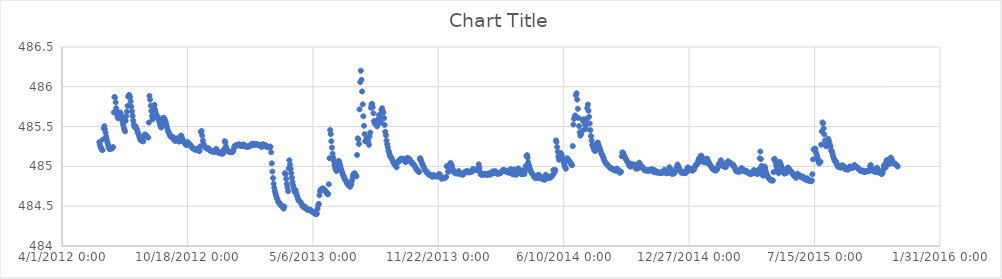
| Category | Series 0 |
|---|---|
| 41059.5 | 485.305 |
| 41060.5 | 485.274 |
| 41061.5 | 485.245 |
| 41062.5 | 485.229 |
| 41063.5 | 485.209 |
| 41064.5 | 485.205 |
| 41065.5 | 485.339 |
| 41066.5 | 485.476 |
| 41067.5 | 485.506 |
| 41068.5 | 485.467 |
| 41069.5 | 485.423 |
| 41070.5 | 485.374 |
| 41071.5 | 485.338 |
| 41072.5 | 485.299 |
| 41073.5 | 485.269 |
| 41074.5 | 485.237 |
| 41075.5 | 485.224 |
| 41076.5 | 485.219 |
| 41077.5 | 485.224 |
| 41078.5 | 485.231 |
| 41079.5 | 485.224 |
| 41080.5 | 485.231 |
| 41081.5 | 485.243 |
| 41082.5 | 485.679 |
| 41083.5 | 485.872 |
| 41084.5 | 485.865 |
| 41085.5 | 485.804 |
| 41086.5 | 485.731 |
| 41087.5 | 485.676 |
| 41088.5 | 485.63 |
| 41089.5 | 485.603 |
| 41090.5 | 485.615 |
| 41091.5 | 485.642 |
| 41092.5 | 485.678 |
| 41093.5 | 485.668 |
| 41094.5 | 485.641 |
| 41095.5 | 485.602 |
| 41096.5 | 485.563 |
| 41097.5 | 485.524 |
| 41098.5 | 485.487 |
| 41099.5 | 485.462 |
| 41100.5 | 485.441 |
| 41101.5 | 485.573 |
| 41102.5 | 485.631 |
| 41103.5 | 485.686 |
| 41104.5 | 485.76 |
| 41105.5 | 485.876 |
| 41106.5 | 485.894 |
| 41107.5 | 485.896 |
| 41108.5 | 485.869 |
| 41109.5 | 485.817 |
| 41110.5 | 485.751 |
| 41111.5 | 485.693 |
| 41112.5 | 485.634 |
| 41113.5 | 485.577 |
| 41114.5 | 485.527 |
| 41115.5 | 485.497 |
| 41116.5 | 485.498 |
| 41117.5 | 485.502 |
| 41118.5 | 485.48 |
| 41119.5 | 485.465 |
| 41120.5 | 485.435 |
| 41121.5 | 485.414 |
| 41122.5 | 485.394 |
| 41123.5 | 485.366 |
| 41124.5 | 485.347 |
| 41125.5 | 485.329 |
| 41126.5 | 485.327 |
| 41127.5 | 485.329 |
| 41128.5 | 485.319 |
| 41129.5 | 485.313 |
| 41130.5 | 485.369 |
| 41131.5 | 485.391 |
| 41132.5 | 485.402 |
| 41133.5 | 485.396 |
| 41134.5 | 485.386 |
| 41135.5 | 485.373 |
| 41136.5 | 485.371 |
| 41137.5 | 485.361 |
| 41138.5 | 485.551 |
| 41139.5 | 485.886 |
| 41140.5 | 485.838 |
| 41141.5 | 485.763 |
| 41142.5 | 485.695 |
| 41143.5 | 485.633 |
| 41144.5 | 485.591 |
| 41145.5 | 485.612 |
| 41146.5 | 485.754 |
| 41147.5 | 485.774 |
| 41148.5 | 485.712 |
| 41149.5 | 485.675 |
| 41150.5 | 485.636 |
| 41151.5 | 485.623 |
| 41152.5 | 485.629 |
| 41153.5 | 485.599 |
| 41154.5 | 485.578 |
| 41155.5 | 485.553 |
| 41156.5 | 485.518 |
| 41157.5 | 485.495 |
| 41158.5 | 485.488 |
| 41159.5 | 485.54 |
| 41160.5 | 485.587 |
| 41161.5 | 485.607 |
| 41162.5 | 485.61 |
| 41163.5 | 485.591 |
| 41164.5 | 485.574 |
| 41165.5 | 485.554 |
| 41166.5 | 485.524 |
| 41167.5 | 485.491 |
| 41168.5 | 485.457 |
| 41169.5 | 485.437 |
| 41170.5 | 485.425 |
| 41171.5 | 485.4 |
| 41172.5 | 485.385 |
| 41173.5 | 485.372 |
| 41174.5 | 485.376 |
| 41175.5 | 485.375 |
| 41176.5 | 485.364 |
| 41177.5 | 485.349 |
| 41178.5 | 485.343 |
| 41179.5 | 485.324 |
| 41180.5 | 485.322 |
| 41181.5 | 485.349 |
| 41182.5 | 485.353 |
| 41183.5 | 485.342 |
| 41184.5 | 485.329 |
| 41185.5 | 485.321 |
| 41186.5 | 485.312 |
| 41187.5 | 485.316 |
| 41188.5 | 485.32 |
| 41189.5 | 485.388 |
| 41190.5 | 485.381 |
| 41191.5 | 485.354 |
| 41192.5 | 485.334 |
| 41193.5 | 485.311 |
| 41194.5 | 485.306 |
| 41195.5 | 485.296 |
| 41196.5 | 485.293 |
| 41197.5 | 485.271 |
| 41198.5 | 485.273 |
| 41199.5 | 485.304 |
| 41200.5 | 485.304 |
| 41201.5 | 485.287 |
| 41202.5 | 485.271 |
| 41203.5 | 485.277 |
| 41204.5 | 485.273 |
| 41205.5 | 485.259 |
| 41206.5 | 485.245 |
| 41207.5 | 485.232 |
| 41208.5 | 485.231 |
| 41209.5 | 485.225 |
| 41210.5 | 485.221 |
| 41211.5 | 485.214 |
| 41212.5 | 485.21 |
| 41213.5 | 485.211 |
| 41214.5 | 485.217 |
| 41215.5 | 485.221 |
| 41216.5 | 485.207 |
| 41217.5 | 485.203 |
| 41218.5 | 485.193 |
| 41219.5 | 485.197 |
| 41220.5 | 485.252 |
| 41221.5 | 485.435 |
| 41222.5 | 485.445 |
| 41223.5 | 485.388 |
| 41224.5 | 485.327 |
| 41225.5 | 485.287 |
| 41226.5 | 485.259 |
| 41227.5 | 485.246 |
| 41228.5 | 485.244 |
| 41229.5 | 485.237 |
| 41230.5 | 485.227 |
| 41231.5 | 485.225 |
| 41232.5 | 485.225 |
| 41233.5 | 485.227 |
| 41234.5 | 485.216 |
| 41235.5 | 485.203 |
| 41236.5 | 485.198 |
| 41237.5 | 485.193 |
| 41238.5 | 485.192 |
| 41239.5 | 485.186 |
| 41240.5 | 485.19 |
| 41241.5 | 485.19 |
| 41242.5 | 485.188 |
| 41243.5 | 485.183 |
| 41244.5 | 485.185 |
| 41245.5 | 485.219 |
| 41246.5 | 485.213 |
| 41247.5 | 485.185 |
| 41248.5 | 485.181 |
| 41249.5 | 485.177 |
| 41250.5 | 485.168 |
| 41251.5 | 485.169 |
| 41252.5 | 485.174 |
| 41253.5 | 485.173 |
| 41254.5 | 485.159 |
| 41255.5 | 485.16 |
| 41256.5 | 485.164 |
| 41257.5 | 485.17 |
| 41258.5 | 485.216 |
| 41259.5 | 485.317 |
| 41260.5 | 485.299 |
| 41261.5 | 485.25 |
| 41262.5 | 485.218 |
| 41263.5 | 485.208 |
| 41264.5 | 485.198 |
| 41265.5 | 485.19 |
| 41266.5 | 485.188 |
| 41267.5 | 485.182 |
| 41268.5 | 485.18 |
| 41269.5 | 485.179 |
| 41270.5 | 485.178 |
| 41271.5 | 485.181 |
| 41272.5 | 485.19 |
| 41273.5 | 485.203 |
| 41274.5 | 485.242 |
| 41275.5 | 485.257 |
| 41276.5 | 485.262 |
| 41277.5 | 485.263 |
| 41278.5 | 485.263 |
| 41279.5 | 485.261 |
| 41280.5 | 485.27 |
| 41281.5 | 485.272 |
| 41282.5 | 485.278 |
| 41283.5 | 485.269 |
| 41284.5 | 485.26 |
| 41285.5 | 485.257 |
| 41286.5 | 485.255 |
| 41287.5 | 485.261 |
| 41288.5 | 485.273 |
| 41289.5 | 485.275 |
| 41290.5 | 485.267 |
| 41291.5 | 485.254 |
| 41292.5 | 485.252 |
| 41293.5 | 485.248 |
| 41294.5 | 485.25 |
| 41295.5 | 485.246 |
| 41296.5 | 485.248 |
| 41297.5 | 485.253 |
| 41298.5 | 485.253 |
| 41299.5 | 485.251 |
| 41300.5 | 485.262 |
| 41301.5 | 485.279 |
| 41302.5 | 485.281 |
| 41303.5 | 485.277 |
| 41304.5 | 485.285 |
| 41305.5 | 485.271 |
| 41306.5 | 485.268 |
| 41307.5 | 485.281 |
| 41308.5 | 485.28 |
| 41309.5 | 485.278 |
| 41310.5 | 485.28 |
| 41311.5 | 485.273 |
| 41312.5 | 485.274 |
| 41313.5 | 485.266 |
| 41314.5 | 485.265 |
| 41315.5 | 485.269 |
| 41316.5 | 485.26 |
| 41317.5 | 485.255 |
| 41318.5 | 485.244 |
| 41319.5 | 485.266 |
| 41320.5 | 485.278 |
| 41321.5 | 485.271 |
| 41322.5 | 485.268 |
| 41323.5 | 485.262 |
| 41324.5 | 485.263 |
| 41325.5 | 485.26 |
| 41326.5 | 485.243 |
| 41327.5 | 485.247 |
| 41328.5 | 485.243 |
| 41329.5 | 485.245 |
| 41330.5 | 485.244 |
| 41331.5 | 485.249 |
| 41332.5 | 485.245 |
| 41333.5 | 485.177 |
| 41334.5 | 485.038 |
| 41335.5 | 484.935 |
| 41336.5 | 484.853 |
| 41337.5 | 484.781 |
| 41338.5 | 484.732 |
| 41339.5 | 484.687 |
| 41340.5 | 484.655 |
| 41341.5 | 484.629 |
| 41342.5 | 484.598 |
| 41343.5 | 484.59 |
| 41344.5 | 484.562 |
| 41345.5 | 484.546 |
| 41346.5 | 484.536 |
| 41347.5 | 484.531 |
| 41348.5 | 484.52 |
| 41349.5 | 484.506 |
| 41350.5 | 484.504 |
| 41351.5 | 484.489 |
| 41352.5 | 484.484 |
| 41353.5 | 484.469 |
| 41354.5 | 484.497 |
| 41355.5 | 484.916 |
| 41356.5 | 484.899 |
| 41357.5 | 484.843 |
| 41358.5 | 484.78 |
| 41359.5 | 484.735 |
| 41360.5 | 484.689 |
| 41361.5 | 484.976 |
| 41362.5 | 485.076 |
| 41363.5 | 485.022 |
| 41364.5 | 484.971 |
| 41365.5 | 484.916 |
| 41366.5 | 484.859 |
| 41367.5 | 484.803 |
| 41368.5 | 484.765 |
| 41369.5 | 484.722 |
| 41370.5 | 484.698 |
| 41371.5 | 484.675 |
| 41372.5 | 484.702 |
| 41373.5 | 484.665 |
| 41374.5 | 484.638 |
| 41375.5 | 484.614 |
| 41376.5 | 484.589 |
| 41377.5 | 484.57 |
| 41378.5 | 484.565 |
| 41379.5 | 484.559 |
| 41380.5 | 484.553 |
| 41381.5 | 484.529 |
| 41382.5 | 484.523 |
| 41383.5 | 484.505 |
| 41384.5 | 484.491 |
| 41385.5 | 484.485 |
| 41386.5 | 484.486 |
| 41387.5 | 484.493 |
| 41388.5 | 484.474 |
| 41389.5 | 484.467 |
| 41390.5 | 484.464 |
| 41391.5 | 484.452 |
| 41392.5 | 484.456 |
| 41393.5 | 484.456 |
| 41394.5 | 484.456 |
| 41395.5 | 484.455 |
| 41396.5 | 484.452 |
| 41397.5 | 484.44 |
| 41398.5 | 484.435 |
| 41399.5 | 484.429 |
| 41400.5 | 484.426 |
| 41401.5 | 484.421 |
| 41402.5 | 484.411 |
| 41403.5 | 484.411 |
| 41404.5 | 484.404 |
| 41405.5 | 484.399 |
| 41406.5 | 484.408 |
| 41407.5 | 484.469 |
| 41408.5 | 484.512 |
| 41409.5 | 484.53 |
| 41410.5 | 484.637 |
| 41411.5 | 484.688 |
| 41412.5 | 484.709 |
| 41413.5 | 484.712 |
| 41414.5 | 484.704 |
| 41415.5 | 484.724 |
| 41416.5 | 484.72 |
| 41417.5 | 484.712 |
| 41418.5 | 484.705 |
| 41419.5 | 484.7 |
| 41420.5 | 484.687 |
| 41421.5 | 484.674 |
| 41422.5 | 484.658 |
| 41423.5 | 484.648 |
| 41424.5 | 484.655 |
| 41425.5 | 484.776 |
| 41426.5 | 485.103 |
| 41427.5 | 485.456 |
| 41428.5 | 485.407 |
| 41429.5 | 485.315 |
| 41430.5 | 485.236 |
| 41431.5 | 485.161 |
| 41432.5 | 485.109 |
| 41433.5 | 485.066 |
| 41434.5 | 485.023 |
| 41435.5 | 484.987 |
| 41436.5 | 484.958 |
| 41437.5 | 484.942 |
| 41438.5 | 484.982 |
| 41439.5 | 485.046 |
| 41440.5 | 485.067 |
| 41441.5 | 485.066 |
| 41442.5 | 485.041 |
| 41443.5 | 485.015 |
| 41444.5 | 484.978 |
| 41445.5 | 484.955 |
| 41446.5 | 484.929 |
| 41447.5 | 484.904 |
| 41448.5 | 484.885 |
| 41449.5 | 484.869 |
| 41450.5 | 484.846 |
| 41451.5 | 484.831 |
| 41452.5 | 484.824 |
| 41453.5 | 484.806 |
| 41454.5 | 484.791 |
| 41455.5 | 484.781 |
| 41456.5 | 484.767 |
| 41457.5 | 484.76 |
| 41458.5 | 484.749 |
| 41459.5 | 484.745 |
| 41460.5 | 484.766 |
| 41461.5 | 484.781 |
| 41462.5 | 484.825 |
| 41463.5 | 484.867 |
| 41464.5 | 484.897 |
| 41465.5 | 484.909 |
| 41466.5 | 484.913 |
| 41467.5 | 484.893 |
| 41468.5 | 484.887 |
| 41469.5 | 484.874 |
| 41470.5 | 485.143 |
| 41471.5 | 485.353 |
| 41472.5 | 485.341 |
| 41473.5 | 485.282 |
| 41474.5 | 485.716 |
| 41475.5 | 486.058 |
| 41476.5 | 486.202 |
| 41477.5 | 486.088 |
| 41478.5 | 485.942 |
| 41479.5 | 485.78 |
| 41480.5 | 485.63 |
| 41481.5 | 485.51 |
| 41482.5 | 485.405 |
| 41483.5 | 485.315 |
| 41484.5 | 485.324 |
| 41485.5 | 485.342 |
| 41486.5 | 485.356 |
| 41487.5 | 485.339 |
| 41488.5 | 485.303 |
| 41489.5 | 485.271 |
| 41490.5 | 485.376 |
| 41491.5 | 485.425 |
| 41492.5 | 485.737 |
| 41493.5 | 485.779 |
| 41494.5 | 485.784 |
| 41495.5 | 485.743 |
| 41496.5 | 485.667 |
| 41497.5 | 485.57 |
| 41498.5 | 485.539 |
| 41499.5 | 485.56 |
| 41500.5 | 485.568 |
| 41501.5 | 485.539 |
| 41502.5 | 485.503 |
| 41503.5 | 485.552 |
| 41504.5 | 485.595 |
| 41505.5 | 485.647 |
| 41506.5 | 485.622 |
| 41507.5 | 485.552 |
| 41508.5 | 485.553 |
| 41509.5 | 485.707 |
| 41510.5 | 485.731 |
| 41511.5 | 485.696 |
| 41512.5 | 485.674 |
| 41513.5 | 485.607 |
| 41514.5 | 485.521 |
| 41515.5 | 485.436 |
| 41516.5 | 485.391 |
| 41517.5 | 485.323 |
| 41518.5 | 485.28 |
| 41519.5 | 485.241 |
| 41520.5 | 485.198 |
| 41521.5 | 485.178 |
| 41522.5 | 485.144 |
| 41523.5 | 485.123 |
| 41524.5 | 485.113 |
| 41525.5 | 485.104 |
| 41526.5 | 485.083 |
| 41527.5 | 485.069 |
| 41528.5 | 485.052 |
| 41529.5 | 485.036 |
| 41530.5 | 485.019 |
| 41531.5 | 485.016 |
| 41532.5 | 485.009 |
| 41533.5 | 484.988 |
| 41534.5 | 485.053 |
| 41535.5 | 485.055 |
| 41536.5 | 485.055 |
| 41537.5 | 485.066 |
| 41538.5 | 485.081 |
| 41539.5 | 485.089 |
| 41540.5 | 485.095 |
| 41541.5 | 485.097 |
| 41542.5 | 485.094 |
| 41543.5 | 485.089 |
| 41544.5 | 485.094 |
| 41545.5 | 485.084 |
| 41546.5 | 485.071 |
| 41547.5 | 485.054 |
| 41548.5 | 485.057 |
| 41549.5 | 485.091 |
| 41550.5 | 485.108 |
| 41551.5 | 485.101 |
| 41552.5 | 485.095 |
| 41553.5 | 485.095 |
| 41554.5 | 485.086 |
| 41555.5 | 485.072 |
| 41556.5 | 485.054 |
| 41557.5 | 485.045 |
| 41558.5 | 485.047 |
| 41559.5 | 485.031 |
| 41560.5 | 485.026 |
| 41561.5 | 485.015 |
| 41562.5 | 485.001 |
| 41563.5 | 484.99 |
| 41564.5 | 484.973 |
| 41565.5 | 484.958 |
| 41566.5 | 484.956 |
| 41567.5 | 484.946 |
| 41568.5 | 484.935 |
| 41569.5 | 484.929 |
| 41570.5 | 485.092 |
| 41571.5 | 485.103 |
| 41572.5 | 485.076 |
| 41573.5 | 485.048 |
| 41574.5 | 485.033 |
| 41575.5 | 485.012 |
| 41576.5 | 484.997 |
| 41577.5 | 484.979 |
| 41578.5 | 484.96 |
| 41579.5 | 484.947 |
| 41580.5 | 484.937 |
| 41581.5 | 484.928 |
| 41582.5 | 484.927 |
| 41583.5 | 484.909 |
| 41584.5 | 484.898 |
| 41585.5 | 484.899 |
| 41586.5 | 484.896 |
| 41587.5 | 484.888 |
| 41588.5 | 484.885 |
| 41589.5 | 484.877 |
| 41590.5 | 484.873 |
| 41591.5 | 484.873 |
| 41592.5 | 484.892 |
| 41593.5 | 484.885 |
| 41594.5 | 484.879 |
| 41595.5 | 484.875 |
| 41596.5 | 484.878 |
| 41597.5 | 484.874 |
| 41598.5 | 484.88 |
| 41599.5 | 484.884 |
| 41600.5 | 484.9 |
| 41601.5 | 484.901 |
| 41602.5 | 484.898 |
| 41603.5 | 484.866 |
| 41604.5 | 484.853 |
| 41605.5 | 484.845 |
| 41606.5 | 484.851 |
| 41607.5 | 484.854 |
| 41608.5 | 484.854 |
| 41609.5 | 484.85 |
| 41610.5 | 484.853 |
| 41611.5 | 484.865 |
| 41612.5 | 484.866 |
| 41613.5 | 485.003 |
| 41614.5 | 484.995 |
| 41615.5 | 484.936 |
| 41616.5 | 484.933 |
| 41617.5 | 484.954 |
| 41618.5 | 485.021 |
| 41619.5 | 485.045 |
| 41620.5 | 485.028 |
| 41621.5 | 485.011 |
| 41622.5 | 484.975 |
| 41623.5 | 484.955 |
| 41624.5 | 484.936 |
| 41625.5 | 484.925 |
| 41626.5 | 484.92 |
| 41627.5 | 484.912 |
| 41628.5 | 484.92 |
| 41629.5 | 484.913 |
| 41630.5 | 484.912 |
| 41631.5 | 484.92 |
| 41632.5 | 484.942 |
| 41633.5 | 484.915 |
| 41634.5 | 484.903 |
| 41635.5 | 484.909 |
| 41636.5 | 484.9 |
| 41637.5 | 484.905 |
| 41638.5 | 484.898 |
| 41639.5 | 484.897 |
| 41640.5 | 484.903 |
| 41641.5 | 484.922 |
| 41642.5 | 484.929 |
| 41643.5 | 484.932 |
| 41644.5 | 484.939 |
| 41645.5 | 484.942 |
| 41646.5 | 484.937 |
| 41647.5 | 484.927 |
| 41648.5 | 484.928 |
| 41649.5 | 484.925 |
| 41650.5 | 484.929 |
| 41651.5 | 484.931 |
| 41652.5 | 484.928 |
| 41653.5 | 484.941 |
| 41654.5 | 484.962 |
| 41655.5 | 484.965 |
| 41656.5 | 484.961 |
| 41657.5 | 484.957 |
| 41658.5 | 484.952 |
| 41659.5 | 484.958 |
| 41660.5 | 484.956 |
| 41661.5 | 484.953 |
| 41662.5 | 484.955 |
| 41663.5 | 484.973 |
| 41664.5 | 485.026 |
| 41665.5 | 484.982 |
| 41666.5 | 484.933 |
| 41667.5 | 484.9 |
| 41668.5 | 484.9 |
| 41669.5 | 484.895 |
| 41670.5 | 484.9 |
| 41671.5 | 484.895 |
| 41672.5 | 484.899 |
| 41673.5 | 484.904 |
| 41674.5 | 484.907 |
| 41675.5 | 484.9 |
| 41676.5 | 484.898 |
| 41677.5 | 484.898 |
| 41678.5 | 484.89 |
| 41679.5 | 484.898 |
| 41680.5 | 484.913 |
| 41681.5 | 484.903 |
| 41682.5 | 484.9 |
| 41683.5 | 484.898 |
| 41684.5 | 484.919 |
| 41685.5 | 484.923 |
| 41686.5 | 484.936 |
| 41687.5 | 484.935 |
| 41688.5 | 484.914 |
| 41689.5 | 484.917 |
| 41690.5 | 484.938 |
| 41691.5 | 484.935 |
| 41692.5 | 484.916 |
| 41693.5 | 484.911 |
| 41694.5 | 484.907 |
| 41695.5 | 484.909 |
| 41696.5 | 484.913 |
| 41697.5 | 484.915 |
| 41698.5 | 484.914 |
| 41699.5 | 484.916 |
| 41700.5 | 484.93 |
| 41701.5 | 484.94 |
| 41702.5 | 484.948 |
| 41703.5 | 484.953 |
| 41704.5 | 484.953 |
| 41705.5 | 484.953 |
| 41706.5 | 484.943 |
| 41707.5 | 484.945 |
| 41708.5 | 484.934 |
| 41709.5 | 484.927 |
| 41710.5 | 484.931 |
| 41711.5 | 484.938 |
| 41712.5 | 484.929 |
| 41713.5 | 484.917 |
| 41714.5 | 484.957 |
| 41715.5 | 484.966 |
| 41716.5 | 484.943 |
| 41717.5 | 484.922 |
| 41718.5 | 484.904 |
| 41719.5 | 484.899 |
| 41720.5 | 484.961 |
| 41721.5 | 484.944 |
| 41722.5 | 484.924 |
| 41723.5 | 484.9 |
| 41724.5 | 484.896 |
| 41725.5 | 484.921 |
| 41726.5 | 484.957 |
| 41727.5 | 484.975 |
| 41728.5 | 484.95 |
| 41729.5 | 484.948 |
| 41730.5 | 484.928 |
| 41731.5 | 484.912 |
| 41732.5 | 484.902 |
| 41733.5 | 484.949 |
| 41734.5 | 484.948 |
| 41735.5 | 484.926 |
| 41736.5 | 484.905 |
| 41737.5 | 484.906 |
| 41738.5 | 484.944 |
| 41739.5 | 485.006 |
| 41740.5 | 485.132 |
| 41741.5 | 485.142 |
| 41742.5 | 485.11 |
| 41743.5 | 485.051 |
| 41744.5 | 485.016 |
| 41745.5 | 484.985 |
| 41746.5 | 484.959 |
| 41747.5 | 484.937 |
| 41748.5 | 484.925 |
| 41749.5 | 484.909 |
| 41750.5 | 484.901 |
| 41751.5 | 484.893 |
| 41752.5 | 484.88 |
| 41753.5 | 484.861 |
| 41754.5 | 484.862 |
| 41755.5 | 484.858 |
| 41756.5 | 484.854 |
| 41757.5 | 484.854 |
| 41758.5 | 484.854 |
| 41759.5 | 484.896 |
| 41760.5 | 484.892 |
| 41761.5 | 484.875 |
| 41762.5 | 484.859 |
| 41763.5 | 484.853 |
| 41764.5 | 484.846 |
| 41765.5 | 484.849 |
| 41766.5 | 484.849 |
| 41767.5 | 484.847 |
| 41768.5 | 484.838 |
| 41769.5 | 484.83 |
| 41770.5 | 484.883 |
| 41771.5 | 484.894 |
| 41772.5 | 484.884 |
| 41773.5 | 484.866 |
| 41774.5 | 484.855 |
| 41775.5 | 484.854 |
| 41776.5 | 484.858 |
| 41777.5 | 484.857 |
| 41778.5 | 484.857 |
| 41779.5 | 484.869 |
| 41780.5 | 484.881 |
| 41781.5 | 484.878 |
| 41782.5 | 484.891 |
| 41783.5 | 484.954 |
| 41784.5 | 484.949 |
| 41785.5 | 484.924 |
| 41786.5 | 484.954 |
| 41787.5 | 485.327 |
| 41788.5 | 485.308 |
| 41789.5 | 485.243 |
| 41790.5 | 485.182 |
| 41791.5 | 485.124 |
| 41792.5 | 485.083 |
| 41793.5 | 485.112 |
| 41794.5 | 485.167 |
| 41795.5 | 485.164 |
| 41796.5 | 485.149 |
| 41797.5 | 485.123 |
| 41798.5 | 485.09 |
| 41799.5 | 485.066 |
| 41800.5 | 485.036 |
| 41801.5 | 485.007 |
| 41802.5 | 484.984 |
| 41803.5 | 484.971 |
| 41804.5 | 485.079 |
| 41805.5 | 485.102 |
| 41806.5 | 485.093 |
| 41807.5 | 485.084 |
| 41808.5 | 485.07 |
| 41809.5 | 485.059 |
| 41810.5 | 485.047 |
| 41811.5 | 485.04 |
| 41812.5 | 485.018 |
| 41813.5 | 485.015 |
| 41814.5 | 485.256 |
| 41815.5 | 485.526 |
| 41816.5 | 485.598 |
| 41817.5 | 485.628 |
| 41818.5 | 485.64 |
| 41819.5 | 485.895 |
| 41820.5 | 485.919 |
| 41821.5 | 485.84 |
| 41822.5 | 485.723 |
| 41823.5 | 485.608 |
| 41824.5 | 485.506 |
| 41825.5 | 485.427 |
| 41826.5 | 485.386 |
| 41827.5 | 485.403 |
| 41828.5 | 485.436 |
| 41829.5 | 485.448 |
| 41830.5 | 485.578 |
| 41831.5 | 485.592 |
| 41832.5 | 485.565 |
| 41833.5 | 485.542 |
| 41834.5 | 485.51 |
| 41835.5 | 485.47 |
| 41836.5 | 485.595 |
| 41837.5 | 485.731 |
| 41838.5 | 485.777 |
| 41839.5 | 485.7 |
| 41840.5 | 485.623 |
| 41841.5 | 485.539 |
| 41842.5 | 485.455 |
| 41843.5 | 485.382 |
| 41844.5 | 485.325 |
| 41845.5 | 485.272 |
| 41846.5 | 485.258 |
| 41847.5 | 485.233 |
| 41848.5 | 485.207 |
| 41849.5 | 485.196 |
| 41850.5 | 485.195 |
| 41851.5 | 485.233 |
| 41852.5 | 485.26 |
| 41853.5 | 485.294 |
| 41854.5 | 485.299 |
| 41855.5 | 485.272 |
| 41856.5 | 485.244 |
| 41857.5 | 485.229 |
| 41858.5 | 485.206 |
| 41859.5 | 485.176 |
| 41860.5 | 485.155 |
| 41861.5 | 485.145 |
| 41862.5 | 485.124 |
| 41863.5 | 485.101 |
| 41864.5 | 485.083 |
| 41865.5 | 485.06 |
| 41866.5 | 485.051 |
| 41867.5 | 485.04 |
| 41868.5 | 485.029 |
| 41869.5 | 485.02 |
| 41870.5 | 485.012 |
| 41871.5 | 485.002 |
| 41872.5 | 484.994 |
| 41873.5 | 484.985 |
| 41874.5 | 484.985 |
| 41875.5 | 484.971 |
| 41876.5 | 484.975 |
| 41877.5 | 484.968 |
| 41878.5 | 484.965 |
| 41879.5 | 484.959 |
| 41880.5 | 484.961 |
| 41881.5 | 484.947 |
| 41882.5 | 484.957 |
| 41883.5 | 484.948 |
| 41884.5 | 484.973 |
| 41885.5 | 484.965 |
| 41886.5 | 484.957 |
| 41887.5 | 484.94 |
| 41888.5 | 484.928 |
| 41889.5 | 484.921 |
| 41890.5 | 484.925 |
| 41891.5 | 484.934 |
| 41892.5 | 485.128 |
| 41893.5 | 485.176 |
| 41894.5 | 485.171 |
| 41895.5 | 485.152 |
| 41896.5 | 485.137 |
| 41897.5 | 485.118 |
| 41898.5 | 485.099 |
| 41899.5 | 485.09 |
| 41900.5 | 485.073 |
| 41901.5 | 485.06 |
| 41902.5 | 485.048 |
| 41903.5 | 485.034 |
| 41904.5 | 485.01 |
| 41905.5 | 485.009 |
| 41906.5 | 484.995 |
| 41907.5 | 485.034 |
| 41908.5 | 485.029 |
| 41909.5 | 485.015 |
| 41910.5 | 485.022 |
| 41911.5 | 485.012 |
| 41912.5 | 485.023 |
| 41913.5 | 485.01 |
| 41914.5 | 484.983 |
| 41915.5 | 484.973 |
| 41916.5 | 484.973 |
| 41917.5 | 484.979 |
| 41918.5 | 484.976 |
| 41919.5 | 485.033 |
| 41920.5 | 485.048 |
| 41921.5 | 485.028 |
| 41922.5 | 485.006 |
| 41923.5 | 484.99 |
| 41924.5 | 484.987 |
| 41925.5 | 484.989 |
| 41926.5 | 484.986 |
| 41927.5 | 484.971 |
| 41928.5 | 484.958 |
| 41929.5 | 484.952 |
| 41930.5 | 484.951 |
| 41931.5 | 484.954 |
| 41932.5 | 484.948 |
| 41933.5 | 484.946 |
| 41934.5 | 484.944 |
| 41935.5 | 484.951 |
| 41936.5 | 484.955 |
| 41937.5 | 484.956 |
| 41938.5 | 484.949 |
| 41939.5 | 484.957 |
| 41940.5 | 484.966 |
| 41941.5 | 484.95 |
| 41942.5 | 484.946 |
| 41943.5 | 484.93 |
| 41944.5 | 484.937 |
| 41945.5 | 484.951 |
| 41946.5 | 484.936 |
| 41947.5 | 484.923 |
| 41948.5 | 484.927 |
| 41949.5 | 484.925 |
| 41950.5 | 484.927 |
| 41951.5 | 484.923 |
| 41952.5 | 484.924 |
| 41953.5 | 484.924 |
| 41954.5 | 484.917 |
| 41955.5 | 484.915 |
| 41956.5 | 484.917 |
| 41957.5 | 484.926 |
| 41958.5 | 484.924 |
| 41959.5 | 484.94 |
| 41960.5 | 484.959 |
| 41961.5 | 484.938 |
| 41962.5 | 484.919 |
| 41963.5 | 484.92 |
| 41964.5 | 484.914 |
| 41965.5 | 484.922 |
| 41966.5 | 484.921 |
| 41967.5 | 484.921 |
| 41968.5 | 484.989 |
| 41969.5 | 484.972 |
| 41970.5 | 484.936 |
| 41971.5 | 484.92 |
| 41972.5 | 484.908 |
| 41973.5 | 484.905 |
| 41974.5 | 484.913 |
| 41975.5 | 484.924 |
| 41976.5 | 484.914 |
| 41977.5 | 484.942 |
| 41978.5 | 484.947 |
| 41979.5 | 484.976 |
| 41980.5 | 484.997 |
| 41981.5 | 485.024 |
| 41982.5 | 485.006 |
| 41983.5 | 484.982 |
| 41984.5 | 484.964 |
| 41985.5 | 484.952 |
| 41986.5 | 484.938 |
| 41987.5 | 484.922 |
| 41988.5 | 484.92 |
| 41989.5 | 484.926 |
| 41990.5 | 484.924 |
| 41991.5 | 484.92 |
| 41992.5 | 484.922 |
| 41993.5 | 484.914 |
| 41994.5 | 484.922 |
| 41995.5 | 484.922 |
| 41996.5 | 484.96 |
| 41997.5 | 484.985 |
| 41998.5 | 484.986 |
| 41999.5 | 484.979 |
| 42000.5 | 484.964 |
| 42001.5 | 484.951 |
| 42002.5 | 484.961 |
| 42003.5 | 484.968 |
| 42004.5 | 484.95 |
| 42005.5 | 484.947 |
| 42006.5 | 484.957 |
| 42007.5 | 484.966 |
| 42008.5 | 484.972 |
| 42009.5 | 485 |
| 42010.5 | 485.019 |
| 42011.5 | 485.021 |
| 42012.5 | 485.024 |
| 42013.5 | 485.047 |
| 42014.5 | 485.072 |
| 42015.5 | 485.099 |
| 42016.5 | 485.089 |
| 42017.5 | 485.059 |
| 42018.5 | 485.13 |
| 42019.5 | 485.135 |
| 42020.5 | 485.113 |
| 42021.5 | 485.087 |
| 42022.5 | 485.073 |
| 42023.5 | 485.054 |
| 42024.5 | 485.053 |
| 42025.5 | 485.072 |
| 42026.5 | 485.063 |
| 42027.5 | 485.046 |
| 42028.5 | 485.098 |
| 42029.5 | 485.081 |
| 42030.5 | 485.062 |
| 42031.5 | 485.046 |
| 42032.5 | 485.032 |
| 42033.5 | 485.016 |
| 42034.5 | 485.012 |
| 42035.5 | 484.991 |
| 42036.5 | 484.984 |
| 42037.5 | 484.968 |
| 42038.5 | 484.963 |
| 42039.5 | 484.959 |
| 42040.5 | 484.955 |
| 42041.5 | 484.95 |
| 42042.5 | 484.949 |
| 42043.5 | 484.953 |
| 42044.5 | 484.964 |
| 42045.5 | 484.989 |
| 42046.5 | 484.999 |
| 42047.5 | 485.031 |
| 42048.5 | 485.034 |
| 42049.5 | 485.025 |
| 42050.5 | 485.077 |
| 42051.5 | 485.06 |
| 42052.5 | 485.027 |
| 42053.5 | 485.004 |
| 42054.5 | 485.022 |
| 42055.5 | 485.013 |
| 42056.5 | 485 |
| 42057.5 | 484.99 |
| 42058.5 | 484.991 |
| 42059.5 | 485.027 |
| 42060.5 | 485.051 |
| 42061.5 | 485.051 |
| 42062.5 | 485.064 |
| 42063.5 | 485.049 |
| 42064.5 | 485.041 |
| 42065.5 | 485.044 |
| 42066.5 | 485.039 |
| 42067.5 | 485.028 |
| 42068.5 | 485.019 |
| 42069.5 | 485.015 |
| 42070.5 | 485.019 |
| 42071.5 | 485.002 |
| 42072.5 | 484.985 |
| 42073.5 | 484.966 |
| 42074.5 | 484.946 |
| 42075.5 | 484.94 |
| 42076.5 | 484.939 |
| 42077.5 | 484.942 |
| 42078.5 | 484.933 |
| 42079.5 | 484.939 |
| 42080.5 | 484.934 |
| 42081.5 | 484.946 |
| 42082.5 | 484.967 |
| 42083.5 | 484.978 |
| 42084.5 | 484.974 |
| 42085.5 | 484.959 |
| 42086.5 | 484.944 |
| 42087.5 | 484.945 |
| 42088.5 | 484.947 |
| 42089.5 | 484.943 |
| 42090.5 | 484.931 |
| 42091.5 | 484.941 |
| 42092.5 | 484.937 |
| 42093.5 | 484.922 |
| 42094.5 | 484.916 |
| 42095.5 | 484.918 |
| 42096.5 | 484.909 |
| 42097.5 | 484.904 |
| 42098.5 | 484.901 |
| 42099.5 | 484.913 |
| 42100.5 | 484.912 |
| 42101.5 | 484.922 |
| 42102.5 | 484.947 |
| 42103.5 | 484.954 |
| 42104.5 | 484.938 |
| 42105.5 | 484.92 |
| 42106.5 | 484.912 |
| 42107.5 | 484.912 |
| 42108.5 | 484.907 |
| 42109.5 | 484.906 |
| 42110.5 | 484.951 |
| 42111.5 | 484.963 |
| 42112.5 | 485.101 |
| 42113.5 | 485.187 |
| 42114.5 | 485.093 |
| 42115.5 | 485.007 |
| 42116.5 | 484.935 |
| 42117.5 | 484.887 |
| 42118.5 | 484.886 |
| 42119.5 | 484.945 |
| 42120.5 | 484.998 |
| 42121.5 | 484.97 |
| 42122.5 | 484.931 |
| 42123.5 | 484.903 |
| 42124.5 | 484.888 |
| 42125.5 | 484.868 |
| 42126.5 | 484.858 |
| 42127.5 | 484.846 |
| 42128.5 | 484.842 |
| 42129.5 | 484.834 |
| 42130.5 | 484.826 |
| 42131.5 | 484.824 |
| 42132.5 | 484.827 |
| 42133.5 | 484.822 |
| 42134.5 | 484.928 |
| 42135.5 | 485.086 |
| 42136.5 | 485.094 |
| 42137.5 | 485.065 |
| 42138.5 | 485.023 |
| 42139.5 | 484.991 |
| 42140.5 | 484.966 |
| 42141.5 | 484.939 |
| 42142.5 | 484.914 |
| 42143.5 | 484.936 |
| 42144.5 | 485.056 |
| 42145.5 | 485.037 |
| 42146.5 | 485.013 |
| 42147.5 | 484.992 |
| 42148.5 | 484.964 |
| 42149.5 | 484.953 |
| 42150.5 | 484.929 |
| 42151.5 | 484.91 |
| 42152.5 | 484.912 |
| 42153.5 | 484.953 |
| 42154.5 | 484.948 |
| 42155.5 | 484.919 |
| 42156.5 | 484.965 |
| 42157.5 | 484.985 |
| 42158.5 | 484.98 |
| 42159.5 | 484.964 |
| 42160.5 | 484.952 |
| 42161.5 | 484.946 |
| 42162.5 | 484.937 |
| 42163.5 | 484.924 |
| 42164.5 | 484.919 |
| 42165.5 | 484.902 |
| 42166.5 | 484.889 |
| 42167.5 | 484.881 |
| 42168.5 | 484.874 |
| 42169.5 | 484.869 |
| 42170.5 | 484.857 |
| 42171.5 | 484.887 |
| 42172.5 | 484.907 |
| 42173.5 | 484.899 |
| 42174.5 | 484.896 |
| 42175.5 | 484.89 |
| 42176.5 | 484.875 |
| 42177.5 | 484.87 |
| 42178.5 | 484.864 |
| 42179.5 | 484.861 |
| 42180.5 | 484.874 |
| 42181.5 | 484.864 |
| 42182.5 | 484.863 |
| 42183.5 | 484.848 |
| 42184.5 | 484.843 |
| 42185.5 | 484.838 |
| 42186.5 | 484.835 |
| 42187.5 | 484.824 |
| 42188.5 | 484.851 |
| 42189.5 | 484.838 |
| 42190.5 | 484.825 |
| 42191.5 | 484.822 |
| 42192.5 | 484.819 |
| 42193.5 | 484.819 |
| 42194.5 | 484.813 |
| 42195.5 | 484.823 |
| 42196.5 | 484.902 |
| 42197.5 | 485.088 |
| 42198.5 | 485.21 |
| 42199.5 | 485.22 |
| 42200.5 | 485.218 |
| 42201.5 | 485.223 |
| 42202.5 | 485.17 |
| 42203.5 | 485.144 |
| 42204.5 | 485.113 |
| 42205.5 | 485.08 |
| 42206.5 | 485.057 |
| 42207.5 | 485.038 |
| 42208.5 | 485.051 |
| 42209.5 | 485.061 |
| 42210.5 | 485.273 |
| 42211.5 | 485.44 |
| 42212.5 | 485.553 |
| 42213.5 | 485.542 |
| 42214.5 | 485.478 |
| 42215.5 | 485.403 |
| 42216.5 | 485.324 |
| 42217.5 | 485.265 |
| 42218.5 | 485.253 |
| 42219.5 | 485.285 |
| 42220.5 | 485.329 |
| 42221.5 | 485.347 |
| 42222.5 | 485.33 |
| 42223.5 | 485.299 |
| 42224.5 | 485.271 |
| 42225.5 | 485.246 |
| 42226.5 | 485.201 |
| 42227.5 | 485.189 |
| 42228.5 | 485.163 |
| 42229.5 | 485.13 |
| 42230.5 | 485.103 |
| 42231.5 | 485.08 |
| 42232.5 | 485.071 |
| 42233.5 | 485.053 |
| 42234.5 | 485.059 |
| 42235.5 | 485.022 |
| 42236.5 | 485.014 |
| 42237.5 | 484.994 |
| 42238.5 | 485.009 |
| 42239.5 | 485.001 |
| 42240.5 | 484.992 |
| 42241.5 | 484.984 |
| 42242.5 | 485.001 |
| 42243.5 | 485.009 |
| 42244.5 | 485.014 |
| 42245.5 | 485.007 |
| 42246.5 | 484.998 |
| 42247.5 | 484.987 |
| 42248.5 | 484.966 |
| 42249.5 | 484.978 |
| 42250.5 | 484.972 |
| 42251.5 | 484.969 |
| 42252.5 | 484.961 |
| 42253.5 | 484.959 |
| 42254.5 | 484.975 |
| 42255.5 | 484.993 |
| 42256.5 | 485 |
| 42257.5 | 484.988 |
| 42258.5 | 484.981 |
| 42259.5 | 484.979 |
| 42260.5 | 484.982 |
| 42261.5 | 484.992 |
| 42262.5 | 484.996 |
| 42263.5 | 485.018 |
| 42264.5 | 485.008 |
| 42265.5 | 484.998 |
| 42266.5 | 484.989 |
| 42267.5 | 484.986 |
| 42268.5 | 484.983 |
| 42269.5 | 484.981 |
| 42270.5 | 484.968 |
| 42271.5 | 484.955 |
| 42272.5 | 484.95 |
| 42273.5 | 484.941 |
| 42274.5 | 484.945 |
| 42275.5 | 484.942 |
| 42276.5 | 484.947 |
| 42277.5 | 484.942 |
| 42278.5 | 484.932 |
| 42279.5 | 484.929 |
| 42280.5 | 484.93 |
| 42281.5 | 484.937 |
| 42282.5 | 484.94 |
| 42283.5 | 484.942 |
| 42284.5 | 484.946 |
| 42285.5 | 484.942 |
| 42286.5 | 484.941 |
| 42287.5 | 484.944 |
| 42288.5 | 485.002 |
| 42289.5 | 485.018 |
| 42290.5 | 484.984 |
| 42291.5 | 484.964 |
| 42292.5 | 484.949 |
| 42293.5 | 484.943 |
| 42294.5 | 484.94 |
| 42295.5 | 484.945 |
| 42296.5 | 484.936 |
| 42297.5 | 484.929 |
| 42298.5 | 484.936 |
| 42299.5 | 484.982 |
| 42300.5 | 484.971 |
| 42301.5 | 484.953 |
| 42302.5 | 484.924 |
| 42303.5 | 484.921 |
| 42304.5 | 484.92 |
| 42305.5 | 484.918 |
| 42306.5 | 484.903 |
| 42307.5 | 484.906 |
| 42308.5 | 484.919 |
| 42309.5 | 484.957 |
| 42310.5 | 485.005 |
| 42311.5 | 485.022 |
| 42312.5 | 484.996 |
| 42313.5 | 484.988 |
| 42314.5 | 485.059 |
| 42315.5 | 485.081 |
| 42316.5 | 485.069 |
| 42317.5 | 485.049 |
| 42318.5 | 485.034 |
| 42319.5 | 485.033 |
| 42320.5 | 485.037 |
| 42321.5 | 485.111 |
| 42322.5 | 485.095 |
| 42323.5 | 485.075 |
| 42324.5 | 485.053 |
| 42325.5 | 485.048 |
| 42326.5 | 485.042 |
| 42327.5 | 485.036 |
| 42328.5 | 485.029 |
| 42329.5 | 485.026 |
| 42330.5 | 485.019 |
| 42331.5 | 485.007 |
| 42332.5 | 484.998 |